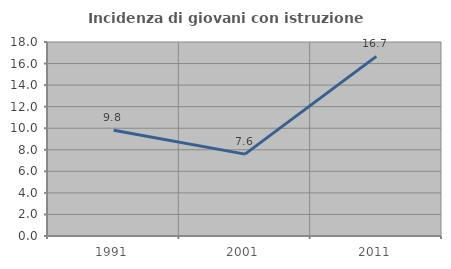
| Category | Incidenza di giovani con istruzione universitaria |
|---|---|
| 1991.0 | 9.804 |
| 2001.0 | 7.595 |
| 2011.0 | 16.667 |